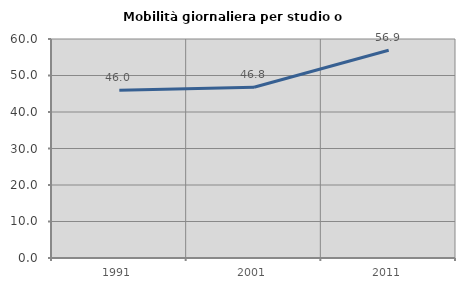
| Category | Mobilità giornaliera per studio o lavoro |
|---|---|
| 1991.0 | 45.952 |
| 2001.0 | 46.798 |
| 2011.0 | 56.932 |